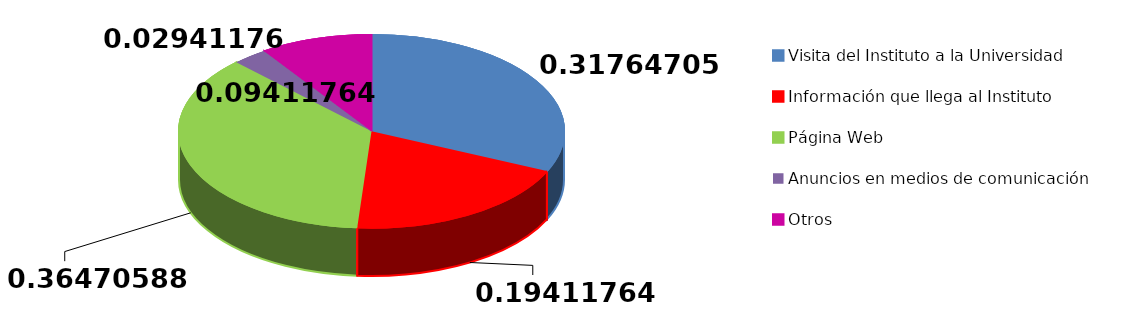
| Category | Series 0 |
|---|---|
| Visita del Instituto a la Universidad | 54 |
| Información que llega al Instituto | 33 |
| Página Web | 62 |
| Anuncios en medios de comunicación | 5 |
| Otros | 16 |